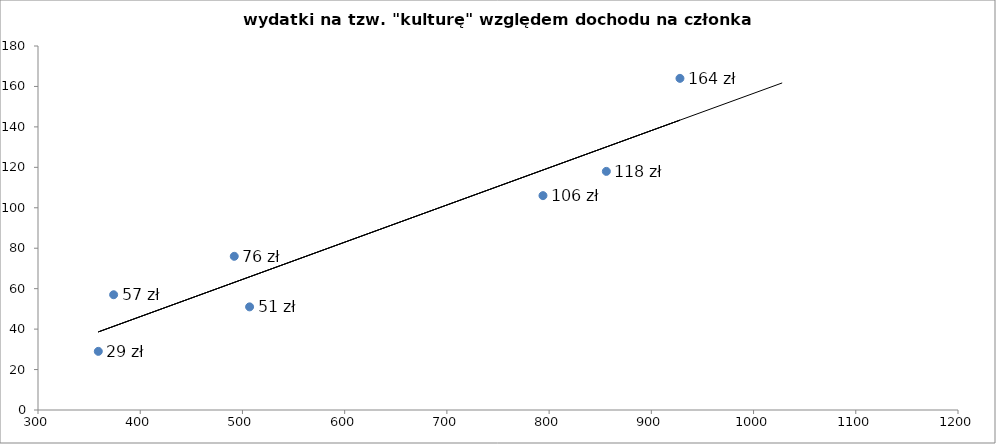
| Category | wydatki |
|---|---|
| 374.0 | 57 |
| 492.0 | 76 |
| 928.0 | 164 |
| 794.0 | 106 |
| 359.0 | 29 |
| 507.0 | 51 |
| 856.0 | 118 |